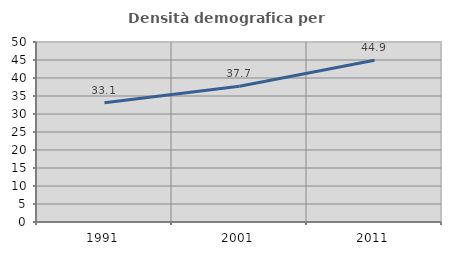
| Category | Densità demografica |
|---|---|
| 1991.0 | 33.118 |
| 2001.0 | 37.682 |
| 2011.0 | 44.944 |